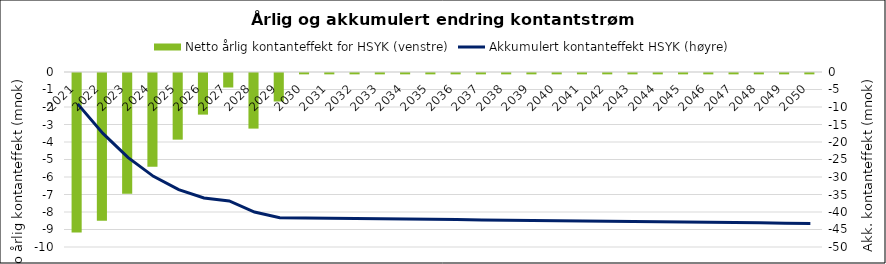
| Category | Netto årlig kontanteffekt for HSYK (venstre) |
|---|---|
| 2021.0 | -9.113 |
| 2022.0 | -8.444 |
| 2023.0 | -6.901 |
| 2024.0 | -5.356 |
| 2025.0 | -3.808 |
| 2026.0 | -2.378 |
| 2027.0 | -0.829 |
| 2028.0 | -3.177 |
| 2029.0 | -1.628 |
| 2030.0 | -0.077 |
| 2031.0 | -0.077 |
| 2032.0 | -0.077 |
| 2033.0 | -0.077 |
| 2034.0 | -0.077 |
| 2035.0 | -0.077 |
| 2036.0 | -0.077 |
| 2037.0 | -0.077 |
| 2038.0 | -0.077 |
| 2039.0 | -0.077 |
| 2040.0 | -0.077 |
| 2041.0 | -0.077 |
| 2042.0 | -0.077 |
| 2043.0 | -0.077 |
| 2044.0 | -0.077 |
| 2045.0 | -0.077 |
| 2046.0 | -0.077 |
| 2047.0 | -0.077 |
| 2048.0 | -0.077 |
| 2049.0 | -0.077 |
| 2050.0 | -0.077 |